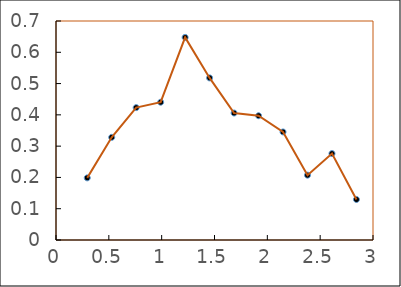
| Category | Series 0 |
|---|---|
| 0.29559795797992733 | 0.199 |
| 0.5272194343133653 | 0.328 |
| 0.7588409106468033 | 0.423 |
| 0.9904623869802412 | 0.44 |
| 1.2220838633136792 | 0.648 |
| 1.4537053396471173 | 0.518 |
| 1.6853268159805552 | 0.406 |
| 1.916948292313993 | 0.397 |
| 2.148569768647431 | 0.345 |
| 2.380191244980869 | 0.207 |
| 2.611812721314307 | 0.276 |
| 2.8434341976477446 | 0.13 |